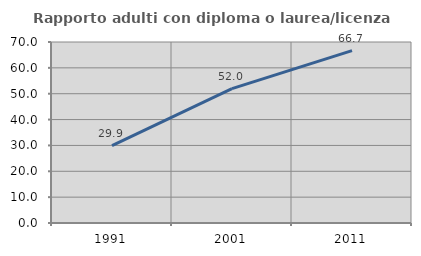
| Category | Rapporto adulti con diploma o laurea/licenza media  |
|---|---|
| 1991.0 | 29.885 |
| 2001.0 | 51.955 |
| 2011.0 | 66.667 |